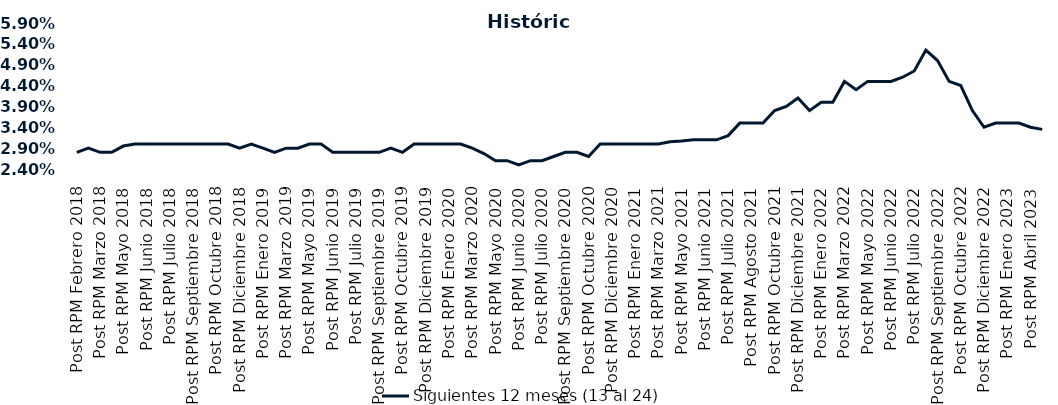
| Category | Siguientes 12 meses (13 al 24)  |
|---|---|
| Post RPM Febrero 2018 | 0.028 |
| Pre RPM Marzo 2018 | 0.029 |
| Post RPM Marzo 2018 | 0.028 |
| Pre RPM Mayo 2018 | 0.028 |
| Post RPM Mayo 2018 | 0.03 |
| Pre RPM Junio 2018 | 0.03 |
| Post RPM Junio 2018 | 0.03 |
| Pre RPM Julio 2018 | 0.03 |
| Post RPM Julio 2018 | 0.03 |
| Pre RPM Septiembre 2018 | 0.03 |
| Post RPM Septiembre 2018 | 0.03 |
| Pre RPM Octubre 2018 | 0.03 |
| Post RPM Octubre 2018 | 0.03 |
| Pre RPM Diciembre 2018 | 0.03 |
| Post RPM Diciembre 2018 | 0.029 |
| Pre RPM Enero 2019 | 0.03 |
| Post RPM Enero 2019 | 0.029 |
| Pre RPM Marzo 2019 | 0.028 |
| Post RPM Marzo 2019 | 0.029 |
| Pre RPM Mayo 2019 | 0.029 |
| Post RPM Mayo 2019 | 0.03 |
| Pre RPM Junio 2019 | 0.03 |
| Post RPM Junio 2019 | 0.028 |
| Pre RPM Julio 2019 | 0.028 |
| Post RPM Julio 2019 | 0.028 |
| Pre RPM Septiembre 2019 | 0.028 |
| Post RPM Septiembre 2019 | 0.028 |
| Pre RPM Octubre 2019 | 0.029 |
| Post RPM Octubre 2019 | 0.028 |
| Pre RPM Diciembre 2019 | 0.03 |
| Post RPM Diciembre 2019 | 0.03 |
| Pre RPM Enero 2020 | 0.03 |
| Post RPM Enero 2020 | 0.03 |
| Pre RPM Marzo 2020 | 0.03 |
| Post RPM Marzo 2020 | 0.029 |
| Pre RPM Mayo 2020 | 0.028 |
| Post RPM Mayo 2020 | 0.026 |
| Pre RPM Junio 2020 | 0.026 |
| Post RPM Junio 2020 | 0.025 |
| Pre RPM Julio 2020 | 0.026 |
| Post RPM Julio 2020 | 0.026 |
| Pre RPM Septiembre 2020 | 0.027 |
| Post RPM Septiembre 2020 | 0.028 |
| Pre RPM Octubre 2020 | 0.028 |
| Post RPM Octubre 2020 | 0.027 |
| Pre RPM Diciembre 2020 | 0.03 |
| Post RPM Diciembre 2020 | 0.03 |
| Pre RPM Enero 2021 | 0.03 |
| Post RPM Enero 2021 | 0.03 |
| Pre RPM Marzo 2021 | 0.03 |
| Post RPM Marzo 2021 | 0.03 |
| Pre RPM Mayo 2021 | 0.031 |
| Post RPM Mayo 2021 | 0.031 |
| Pre RPM Junio 2021 | 0.031 |
| Post RPM Junio 2021 | 0.031 |
| Pre RPM Julio 2021 | 0.031 |
| Post RPM Julio 2021 | 0.032 |
| Pre RPM Agosto 2021 | 0.035 |
| Post RPM Agosto 2021 | 0.035 |
| Pre RPM Octubre 2021 | 0.035 |
| Post RPM Octubre 2021 | 0.038 |
| Pre RPM Diciembre 2021 | 0.039 |
| Post RPM Diciembre 2021 | 0.041 |
| Pre RPM Enero 2022 | 0.038 |
| Post RPM Enero 2022 | 0.04 |
| Pre RPM Marzo 2022 | 0.04 |
| Post RPM Marzo 2022 | 0.045 |
| Pre RPM Mayo 2022 | 0.043 |
| Post RPM Mayo 2022 | 0.045 |
| Pre RPM Junio 2022 | 0.045 |
| Post RPM Junio 2022 | 0.045 |
| Pre RPM Julio 2022 | 0.046 |
| Post RPM Julio 2022 | 0.048 |
| Pre RPM Septiembre 2022 | 0.052 |
| Post RPM Septiembre 2022 | 0.05 |
| Pre RPM Octubre 2022 | 0.045 |
| Post RPM Octubre 2022 | 0.044 |
| Pre RPM Diciembre 2022 | 0.038 |
| Post RPM Diciembre 2022 | 0.034 |
| Pre RPM Enero 2023 | 0.035 |
| Post RPM Enero 2023 | 0.035 |
| Pre RPM Abril 2023 | 0.035 |
| Post RPM Abril 2023 | 0.034 |
| Pre RPM Mayo 2023 | 0.034 |